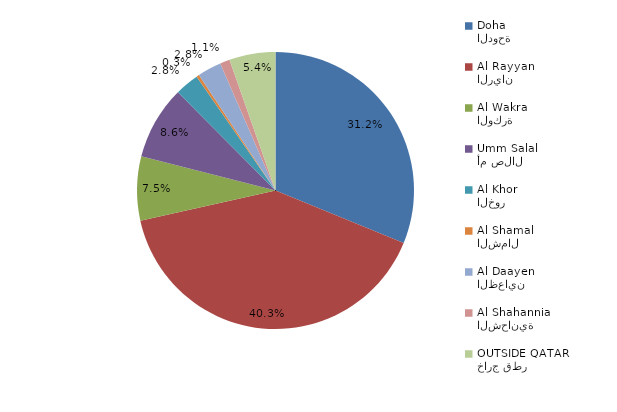
| Category | Series 0 |
|---|---|
| الدوحة
Doha | 301 |
| الريان
Al Rayyan | 389 |
| الوكرة
Al Wakra | 72 |
| أم صلال
Umm Salal | 83 |
| الخور
Al Khor | 27 |
| الشمال
Al Shamal | 3 |
| الظعاين
Al Daayen | 27 |
| الشحانية 
Al Shahannia | 11 |
| خارج قطر
OUTSIDE QATAR | 52 |